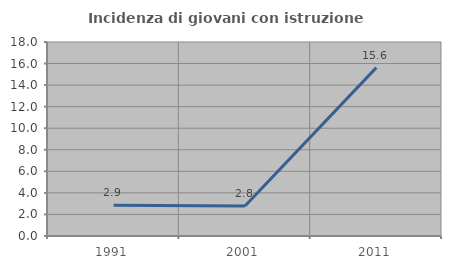
| Category | Incidenza di giovani con istruzione universitaria |
|---|---|
| 1991.0 | 2.857 |
| 2001.0 | 2.778 |
| 2011.0 | 15.625 |